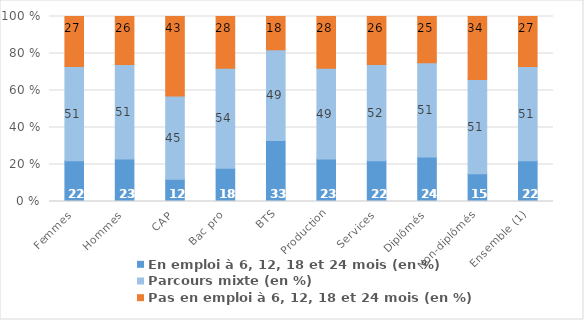
| Category | En emploi à 6, 12, 18 et 24 mois (en %) | Parcours mixte (en %) | Pas en emploi à 6, 12, 18 et 24 mois (en %) |
|---|---|---|---|
| Femmes | 22 | 51 | 27 |
| Hommes | 23 | 51 | 26 |
| CAP | 12 | 45 | 43 |
| Bac pro | 18 | 54 | 28 |
| BTS | 33 | 49 | 18 |
| Production | 23 | 49 | 28 |
| Services | 22 | 52 | 26 |
| Diplômés | 24 | 51 | 25 |
| Non-diplômés | 15 | 51 | 34 |
| Ensemble (1) | 22 | 51 | 27 |